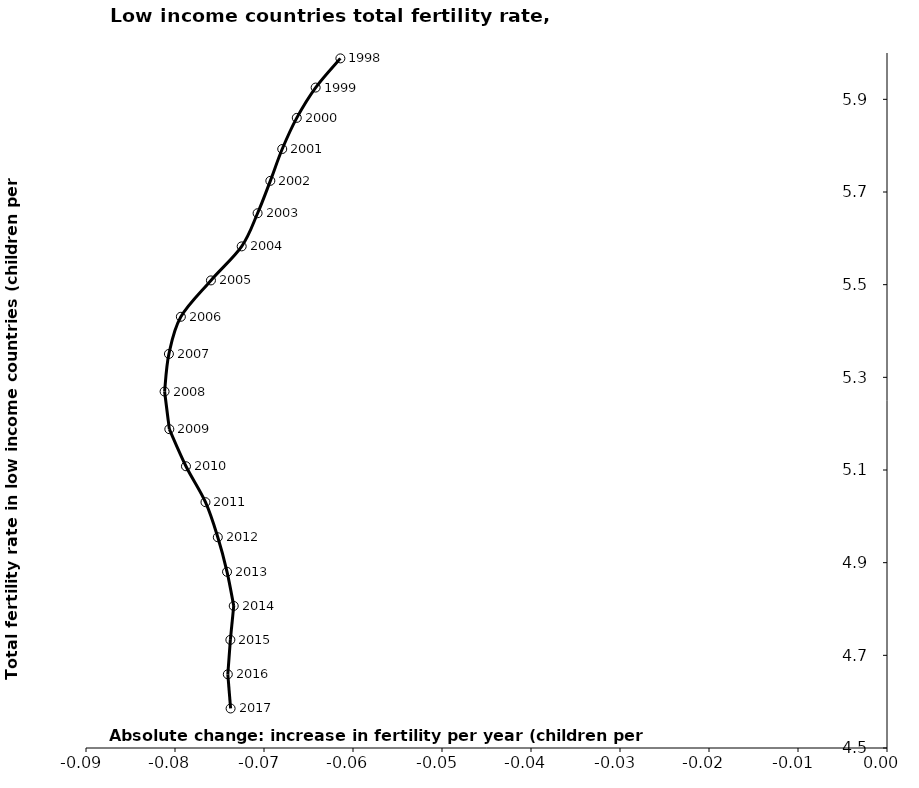
| Category | Series 0 |
|---|---|
| -0.06141746668195225 | 5.988 |
| -0.06419708584241457 | 5.925 |
| -0.06631685424656286 | 5.86 |
| -0.06795135811566189 | 5.793 |
| -0.06928776329291386 | 5.724 |
| -0.07072139659834553 | 5.654 |
| -0.0725063959919634 | 5.583 |
| -0.07596241977748441 | 5.509 |
| -0.07934157576046275 | 5.431 |
| -0.08068342338999779 | 5.35 |
| -0.08117062295814037 | 5.269 |
| -0.08063833490287298 | 5.188 |
| -0.0787672487477864 | 5.108 |
| -0.07657627396602606 | 5.031 |
| -0.07519119947366049 | 4.955 |
| -0.07415298476558485 | 4.88 |
| -0.07340093399065628 | 4.807 |
| -0.07377914799538532 | 4.733 |
| -0.07406542389020165 | 4.659 |
| -0.07375317292998318 | 4.585 |